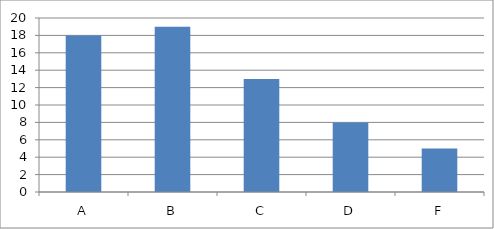
| Category | Series 0 |
|---|---|
| A | 18 |
| B | 19 |
| C | 13 |
| D | 8 |
| F | 5 |